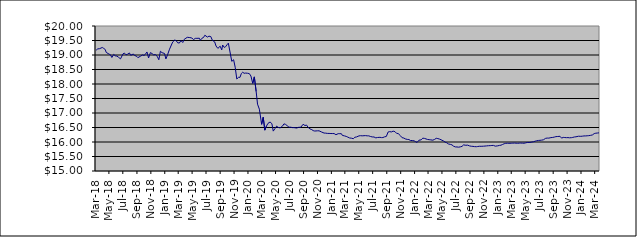
| Category | Series 0 |
|---|---|
| 2014-01-09 | 17.829 |
| 2014-01-17 | 17.839 |
| 2014-01-23 | 17.856 |
| 2014-01-31 | 17.898 |
| 2014-02-10 | 17.911 |
| 2014-02-14 | 17.896 |
| 2014-02-20 | 17.909 |
| 2014-02-28 | 17.915 |
| 2014-03-10 | 17.935 |
| 2014-03-14 | 17.938 |
| 2014-03-20 | 17.941 |
| 2014-03-26 | 17.948 |
| 2014-03-31 | 17.951 |
| 2014-04-09 | 17.961 |
| 2014-04-15 | 17.969 |
| 2014-04-24 | 17.982 |
| 2014-04-30 | 17.986 |
| 2014-05-08 | 18.015 |
| 2014-05-16 | 18.029 |
| 2014-05-22 | 18.045 |
| 2014-05-31 | 18.08 |
| 2014-06-09 | 18.08 |
| 2014-06-16 | 18.079 |
| 2014-06-20 | 18.074 |
| 2014-06-30 | 18.082 |
| 2014-07-09 | 18.086 |
| 2014-07-15 | 18.091 |
| 2014-07-22 | 18.1 |
| 2014-07-31 | 18.122 |
| 2014-08-11 | 18.138 |
| 2014-08-14 | 18.129 |
| 2014-08-21 | 18.141 |
| 2014-08-30 | 18.157 |
| 2014-09-08 | 18.164 |
| 2014-09-16 | 18.173 |
| 2014-09-23 | 18.165 |
| 2014-09-30 | 18.167 |
| 2014-10-09 | 18.174 |
| 2014-10-16 | 18.183 |
| 2014-10-23 | 18.18 |
| 2014-10-31 | 18.181 |
| 2014-11-10 | 18.193 |
| 2014-11-13 | 18.202 |
| 2014-11-20 | 18.192 |
| 2014-11-29 | 18.204 |
| 2014-12-10 | 18.231 |
| 2014-12-18 | 18.179 |
| 2014-12-23 | 18.211 |
| 2014-12-30 | 18.22 |
| 2015-01-08 | 18.22 |
| 2015-01-15 | 18.23 |
| 2015-01-30 | 18.212 |
| 2015-02-10 | 18.216 |
| 2015-02-16 | 18.221 |
| 2015-02-19 | 18.226 |
| 2015-02-28 | 18.234 |
| 2015-03-10 | 18.242 |
| 2015-03-13 | 18.249 |
| 2015-03-19 | 18.257 |
| 2015-03-27 | 18.268 |
| 2015-04-07 | 18.273 |
| 2015-04-16 | 18.305 |
| 2015-04-27 | 18.28 |
| 2015-05-08 | 18.268 |
| 2015-05-14 | 18.264 |
| 2015-05-21 | 18.288 |
| 2015-05-27 | 18.298 |
| 2015-06-03 | 18.316 |
| 2015-06-09 | 18.302 |
| 2015-06-15 | 18.306 |
| 2015-06-22 | 18.31 |
| 2015-06-26 | 18.315 |
| 2015-07-02 | 18.32 |
| 2015-07-09 | 18.329 |
| 2015-07-14 | 18.343 |
| 2015-07-23 | 18.351 |
| 2015-07-29 | 18.351 |
| 2015-08-06 | 18.358 |
| 2015-08-13 | 18.36 |
| 2015-08-20 | 18.351 |
| 2015-08-27 | 18.302 |
| 2015-09-03 | 18.309 |
| 2015-09-09 | 18.31 |
| 2015-09-15 | 18.321 |
| 2015-09-21 | 18.322 |
| 2015-09-28 | 18.321 |
| 2015-10-07 | 18.293 |
| 2015-10-13 | 18.301 |
| 2015-10-22 | 18.329 |
| 2015-10-28 | 18.34 |
| 2015-11-04 | 18.323 |
| 2015-11-13 | 18.267 |
| 2015-11-19 | 18.242 |
| 2015-11-27 | 18.224 |
| 2015-12-03 | 18.263 |
| 2015-12-10 | 18.273 |
| 2015-12-15 | 18.272 |
| 2015-12-23 | 18.29 |
| 2015-12-29 | 18.3 |
| 2016-01-07 | 18.3 |
| 2016-01-14 | 18.266 |
| 2016-01-21 | 18.232 |
| 2016-01-28 | 18.269 |
| 2016-02-04 | 18.268 |
| 2016-02-11 | 18.277 |
| 2016-02-18 | 18.316 |
| 2016-02-25 | 18.324 |
| 2016-03-03 | 18.342 |
| 2016-03-10 | 18.343 |
| 2016-03-16 | 18.356 |
| 2016-03-29 | 18.323 |
| 2016-04-07 | 18.338 |
| 2016-04-14 | 18.363 |
| 2016-04-28 | 18.369 |
| 2016-05-05 | 18.391 |
| 2016-05-12 | 18.41 |
| 2016-05-19 | 18.56 |
| 2016-05-30 | 18.558 |
| 2016-06-03 | 18.566 |
| 2016-06-09 | 18.565 |
| 2016-06-15 | 18.562 |
| 2016-06-23 | 18.524 |
| 2016-06-29 | 18.527 |
| 2016-07-11 | 18.574 |
| 2016-07-14 | 18.58 |
| 2016-07-21 | 18.59 |
| 2016-07-28 | 18.59 |
| 2016-08-04 | 18.598 |
| 2016-08-11 | 18.593 |
| 2016-08-16 | 18.592 |
| 2016-08-24 | 18.622 |
| 2016-08-30 | 18.629 |
| 2016-09-08 | 18.616 |
| 2016-09-15 | 18.571 |
| 2016-09-22 | 18.611 |
| 2016-09-29 | 18.654 |
| 2016-10-06 | 18.651 |
| 2016-10-13 | 18.635 |
| 2016-10-20 | 18.638 |
| 2016-10-28 | 18.638 |
| 2016-11-03 | 18.653 |
| 2016-11-10 | 18.652 |
| 2016-11-15 | 18.584 |
| 2016-11-23 | 18.57 |
| 2016-11-29 | 18.572 |
| 2016-12-07 | 18.59 |
| 2016-12-14 | 18.666 |
| 2016-12-21 | 18.662 |
| 2016-12-28 | 18.682 |
| 2017-01-05 | 18.715 |
| 2017-01-16 | 18.773 |
| 2017-01-23 | 18.778 |
| 2017-01-30 | 18.792 |
| 2017-02-06 | 18.816 |
| 2017-02-13 | 18.845 |
| 2017-02-20 | 18.861 |
| 2017-02-27 | 18.884 |
| 2017-03-06 | 18.876 |
| 2017-03-13 | 18.873 |
| 2017-03-20 | 18.908 |
| 2017-03-27 | 18.936 |
| 2017-03-30 | 18.963 |
| 2017-04-10 | 18.993 |
| 2017-04-18 | 18.999 |
| 2017-04-24 | 18.996 |
| 2017-04-28 | 18.998 |
| 2017-05-08 | 19.011 |
| 2017-05-15 | 19.014 |
| 2017-05-22 | 18.961 |
| 2017-05-30 | 18.984 |
| 2017-06-06 | 19.006 |
| 2017-06-12 | 19.008 |
| 2017-06-15 | 19.008 |
| 2017-06-20 | 19.019 |
| 2017-06-29 | 19.002 |
| 2017-07-04 | 18.985 |
| 2017-07-10 | 18.946 |
| 2017-07-14 | 18.969 |
| 2017-07-19 | 18.987 |
| 2017-07-24 | 18.992 |
| 2017-07-28 | 19.006 |
| 2017-08-03 | 19.026 |
| 2017-08-09 | 19.029 |
| 2017-08-14 | 19.016 |
| 2017-08-21 | 19.022 |
| 2017-08-24 | 19.026 |
| 2017-08-30 | 19.016 |
| 2017-09-07 | 19.05 |
| 2017-09-14 | 19.077 |
| 2017-09-20 | 19.086 |
| 2017-09-29 | 19.061 |
| 2017-10-05 | 19.088 |
| 2017-10-11 | 19.086 |
| 2017-10-16 | 19.095 |
| 2017-10-23 | 19.095 |
| 2017-10-30 | 19.05 |
| 2017-11-07 | 18.817 |
| 2017-11-15 | 18.812 |
| 2017-11-23 | 18.98 |
| 2017-11-29 | 18.961 |
| 2017-12-07 | 18.998 |
| 2017-12-13 | 18.991 |
| 2017-12-18 | 19.029 |
| 2017-12-28 | 19.066 |
| 2018-01-08 | 19.174 |
| 2018-01-17 | 19.204 |
| 2018-01-24 | 19.206 |
| 2018-01-30 | 19.212 |
| 2018-02-05 | 19.204 |
| 2018-02-13 | 19.161 |
| 2018-02-19 | 19.094 |
| 2018-02-27 | 19.122 |
| 2018-03-07 | 19.13 |
| 2018-03-14 | 19.166 |
| 2018-03-21 | 19.21 |
| 2018-03-29 | 19.219 |
| 2018-04-10 | 19.259 |
| 2018-04-16 | 19.229 |
| 2018-04-23 | 19.188 |
| 2018-04-27 | 19.091 |
| 2018-05-10 | 19.029 |
| 2018-05-15 | 19.015 |
| 2018-05-22 | 18.915 |
| 2018-05-30 | 19.02 |
| 2018-06-06 | 18.971 |
| 2018-06-13 | 18.963 |
| 2018-06-20 | 18.923 |
| 2018-06-29 | 18.867 |
| 2018-07-10 | 19.04 |
| 2018-07-16 | 19.066 |
| 2018-07-23 | 19.006 |
| 2018-07-30 | 19.027 |
| 2018-08-07 | 19.071 |
| 2018-08-13 | 18.988 |
| 2018-08-24 | 19.035 |
| 2018-08-30 | 18.98 |
| 2018-09-06 | 18.965 |
| 2018-09-13 | 18.909 |
| 2018-09-24 | 18.955 |
| 2018-09-28 | 18.947 |
| 2018-10-04 | 19.004 |
| 2018-10-10 | 18.984 |
| 2018-10-16 | 19.025 |
| 2018-10-23 | 19.105 |
| 2018-10-30 | 18.898 |
| 2018-11-07 | 19.082 |
| 2018-11-15 | 19.046 |
| 2018-11-21 | 19.006 |
| 2018-11-29 | 19.013 |
| 2018-12-07 | 18.954 |
| 2018-12-14 | 18.836 |
| 2018-12-21 | 19.131 |
| 2018-12-28 | 19.08 |
| 2019-01-08 | 19.053 |
| 2019-01-14 | 18.864 |
| 2019-01-21 | 19.002 |
| 2019-01-30 | 19.201 |
| 2019-02-11 | 19.415 |
| 2019-02-14 | 19.459 |
| 2019-02-21 | 19.513 |
| 2019-02-27 | 19.503 |
| 2019-03-07 | 19.421 |
| 2019-03-14 | 19.412 |
| 2019-03-21 | 19.496 |
| 2019-03-29 | 19.43 |
| 2019-04-04 | 19.536 |
| 2019-04-12 | 19.581 |
| 2019-04-18 | 19.61 |
| 2019-04-29 | 19.601 |
| 2019-05-08 | 19.587 |
| 2019-05-15 | 19.53 |
| 2019-05-23 | 19.573 |
| 2019-05-30 | 19.575 |
| 2019-06-10 | 19.578 |
| 2019-06-14 | 19.507 |
| 2019-06-21 | 19.577 |
| 2019-06-28 | 19.603 |
| 2019-07-04 | 19.682 |
| 2019-07-15 | 19.618 |
| 2019-07-22 | 19.65 |
| 2019-07-30 | 19.635 |
| 2019-08-06 | 19.506 |
| 2019-08-16 | 19.452 |
| 2019-08-22 | 19.31 |
| 2019-08-30 | 19.228 |
| 2019-09-09 | 19.304 |
| 2019-09-16 | 19.176 |
| 2019-09-20 | 19.344 |
| 2019-09-27 | 19.26 |
| 2019-10-03 | 19.286 |
| 2019-10-09 | 19.352 |
| 2019-10-15 | 19.408 |
| 2019-10-30 | 18.781 |
| 2019-11-07 | 18.837 |
| 2019-11-14 | 18.578 |
| 2019-11-21 | 18.173 |
| 2019-11-29 | 18.232 |
| 2019-12-05 | 18.228 |
| 2019-12-11 | 18.362 |
| 2019-12-17 | 18.407 |
| 2019-12-23 | 18.369 |
| 2019-12-30 | 18.377 |
| 2020-01-07 | 18.371 |
| 2020-01-15 | 18.358 |
| 2020-01-22 | 18.276 |
| 2020-01-30 | 18.021 |
| 2020-02-06 | 18.246 |
| 2020-02-14 | 17.74 |
| 2020-02-20 | 17.306 |
| 2020-02-28 | 17.133 |
| 2020-03-09 | 16.609 |
| 2020-03-16 | 16.854 |
| 2020-03-23 | 16.409 |
| 2020-03-30 | 16.546 |
| 2020-04-06 | 16.643 |
| 2020-04-15 | 16.689 |
| 2020-04-23 | 16.632 |
| 2020-04-29 | 16.375 |
| 2020-05-06 | 16.456 |
| 2020-05-14 | 16.548 |
| 2020-05-20 | 16.506 |
| 2020-05-29 | 16.485 |
| 2020-06-08 | 16.544 |
| 2020-06-15 | 16.626 |
| 2020-06-22 | 16.606 |
| 2020-06-29 | 16.562 |
| 2020-07-07 | 16.509 |
| 2020-07-15 | 16.51 |
| 2020-07-22 | 16.496 |
| 2020-07-29 | 16.496 |
| 2020-08-10 | 16.481 |
| 2020-08-17 | 16.504 |
| 2020-08-21 | 16.493 |
| 2020-08-28 | 16.511 |
| 2020-09-07 | 16.612 |
| 2020-09-15 | 16.568 |
| 2020-09-22 | 16.584 |
| 2020-09-29 | 16.503 |
| 2020-10-07 | 16.452 |
| 2020-10-15 | 16.426 |
| 2020-10-21 | 16.393 |
| 2020-10-28 | 16.378 |
| 2020-11-10 | 16.386 |
| 2020-11-16 | 16.386 |
| 2020-11-20 | 16.373 |
| 2020-11-27 | 16.344 |
| 2020-12-08 | 16.308 |
| 2020-12-15 | 16.306 |
| 2020-12-22 | 16.296 |
| 2020-12-30 | 16.296 |
| 2021-01-07 | 16.292 |
| 2021-01-15 | 16.291 |
| 2021-01-21 | 16.291 |
| 2021-01-29 | 16.251 |
| 2021-02-08 | 16.287 |
| 2021-02-15 | 16.287 |
| 2021-02-22 | 16.286 |
| 2021-02-26 | 16.228 |
| 2021-03-08 | 16.21 |
| 2021-03-15 | 16.193 |
| 2021-03-22 | 16.168 |
| 2021-03-30 | 16.139 |
| 2021-04-08 | 16.13 |
| 2021-04-15 | 16.113 |
| 2021-04-22 | 16.165 |
| 2021-04-29 | 16.173 |
| 2021-05-10 | 16.211 |
| 2021-05-17 | 16.218 |
| 2021-05-24 | 16.213 |
| 2021-05-28 | 16.225 |
| 2021-06-07 | 16.22 |
| 2021-06-15 | 16.213 |
| 2021-06-22 | 16.211 |
| 2021-06-29 | 16.191 |
| 2021-07-07 | 16.175 |
| 2021-07-15 | 16.173 |
| 2021-07-23 | 16.142 |
| 2021-07-30 | 16.155 |
| 2021-08-10 | 16.161 |
| 2021-08-17 | 16.152 |
| 2021-08-23 | 16.154 |
| 2021-08-30 | 16.177 |
| 2021-09-07 | 16.191 |
| 2021-09-15 | 16.347 |
| 2021-09-22 | 16.358 |
| 2021-09-29 | 16.347 |
| 2021-10-07 | 16.374 |
| 2021-10-15 | 16.357 |
| 2021-10-22 | 16.298 |
| 2021-10-29 | 16.291 |
| 2021-11-08 | 16.216 |
| 2021-11-15 | 16.149 |
| 2021-11-23 | 16.136 |
| 2021-11-29 | 16.108 |
| 2021-12-08 | 16.089 |
| 2021-12-15 | 16.085 |
| 2021-12-22 | 16.052 |
| 2021-12-30 | 16.05 |
| 2022-01-07 | 16.04 |
| 2022-01-14 | 16.009 |
| 2022-01-20 | 15.985 |
| 2022-01-28 | 16.061 |
| 2022-02-07 | 16.075 |
| 2022-02-14 | 16.133 |
| 2022-02-21 | 16.125 |
| 2022-02-25 | 16.108 |
| 2022-03-07 | 16.088 |
| 2022-03-14 | 16.08 |
| 2022-03-21 | 16.074 |
| 2022-03-30 | 16.063 |
| 2022-04-07 | 16.091 |
| 2022-04-14 | 16.128 |
| 2022-04-21 | 16.118 |
| 2022-04-29 | 16.098 |
| 2022-05-09 | 16.062 |
| 2022-05-16 | 16.035 |
| 2022-05-23 | 15.994 |
| 2022-05-30 | 15.974 |
| 2022-06-07 | 15.931 |
| 2022-06-15 | 15.918 |
| 2022-06-22 | 15.901 |
| 2022-06-29 | 15.855 |
| 2022-07-07 | 15.83 |
| 2022-07-14 | 15.829 |
| 2022-07-21 | 15.822 |
| 2022-07-29 | 15.834 |
| 2022-08-05 | 15.849 |
| 2022-08-12 | 15.9 |
| 2022-08-22 | 15.887 |
| 2022-08-30 | 15.892 |
| 2022-09-07 | 15.865 |
| 2022-09-15 | 15.853 |
| 2022-09-22 | 15.849 |
| 2022-09-29 | 15.841 |
| 2022-10-07 | 15.837 |
| 2022-10-13 | 15.845 |
| 2022-10-20 | 15.852 |
| 2022-10-28 | 15.852 |
| 2022-11-07 | 15.855 |
| 2022-11-14 | 15.86 |
| 2022-11-21 | 15.866 |
| 2022-11-29 | 15.872 |
| 2022-12-07 | 15.875 |
| 2022-12-14 | 15.88 |
| 2022-12-21 | 15.883 |
| 2022-12-29 | 15.856 |
| 2023-01-09 | 15.868 |
| 2023-01-16 | 15.882 |
| 2023-01-23 | 15.89 |
| 2023-01-30 | 15.915 |
| 2023-02-06 | 15.94 |
| 2023-02-13 | 15.955 |
| 2023-02-20 | 15.957 |
| 2023-02-27 | 15.955 |
| 2023-03-09 | 15.957 |
| 2023-03-16 | 15.96 |
| 2023-03-23 | 15.963 |
| 2023-03-30 | 15.96 |
| 2023-04-06 | 15.956 |
| 2023-04-13 | 15.961 |
| 2023-04-20 | 15.964 |
| 2023-04-28 | 15.959 |
| 2023-05-04 | 15.958 |
| 2023-05-11 | 15.969 |
| 2023-05-18 | 15.984 |
| 2023-05-30 | 15.984 |
| 2023-06-08 | 15.999 |
| 2023-06-15 | 16.009 |
| 2023-06-22 | 16.029 |
| 2023-06-27 | 16.041 |
| 2023-07-06 | 16.053 |
| 2023-07-13 | 16.058 |
| 2023-07-20 | 16.064 |
| 2023-07-28 | 16.076 |
| 2023-08-07 | 16.128 |
| 2023-08-14 | 16.135 |
| 2023-08-21 | 16.134 |
| 2023-08-30 | 16.151 |
| 2023-09-07 | 16.158 |
| 2023-09-14 | 16.17 |
| 2023-09-21 | 16.185 |
| 2023-09-29 | 16.19 |
| 2023-10-09 | 16.196 |
| 2023-10-16 | 16.133 |
| 2023-10-23 | 16.159 |
| 2023-10-30 | 16.154 |
| 2023-11-06 | 16.149 |
| 2023-11-13 | 16.152 |
| 2023-11-20 | 16.145 |
| 2023-11-29 | 16.15 |
| 2023-12-04 | 16.159 |
| 2023-12-11 | 16.173 |
| 2023-12-18 | 16.179 |
| 2023-12-29 | 16.199 |
| 2024-01-08 | 16.196 |
| 2024-01-15 | 16.201 |
| 2024-01-22 | 16.21 |
| 2024-01-30 | 16.21 |
| 2024-02-05 | 16.214 |
| 2024-02-12 | 16.219 |
| 2024-02-19 | 16.228 |
| 2024-02-28 | 16.243 |
| 2024-03-07 | 16.289 |
| 2024-03-14 | 16.303 |
| 2024-03-21 | 16.309 |
| 2024-03-28 | 16.316 |